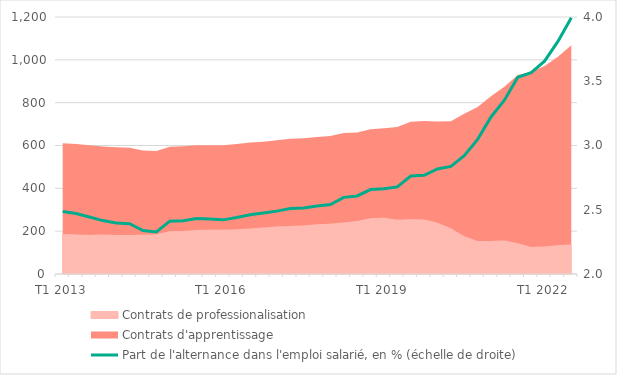
| Category | Part de l'alternance dans l'emploi salarié, en % (échelle de droite) |
|---|---|
| T1 2013 | 2.487 |
| T2 2013 | 2.471 |
| T3 2013 | 2.443 |
| T4 2013 | 2.416 |
| T1 2014 | 2.397 |
| T2 2014 | 2.391 |
| T3 2014 | 2.338 |
| T4 2014 | 2.327 |
| T1 2015 | 2.411 |
| T2 2015 | 2.414 |
| T3 2015 | 2.431 |
| T4 2015 | 2.427 |
| T1 2016 | 2.421 |
| T2 2016 | 2.439 |
| T3 2016 | 2.461 |
| T4 2016 | 2.475 |
| T1 2017 | 2.489 |
| T2 2017 | 2.509 |
| T3 2017 | 2.514 |
| T4 2017 | 2.529 |
| T1 2018 | 2.541 |
| T2 2018 | 2.596 |
| T3 2018 | 2.607 |
| T4 2018 | 2.657 |
| T1 2019 | 2.663 |
| T2 2019 | 2.678 |
| T3 2019 | 2.763 |
| T4 2019 | 2.768 |
| T1 2020 | 2.818 |
| T2 2020 | 2.838 |
| T3 2020 | 2.92 |
| T4 2020 | 3.048 |
| T1 2021 | 3.222 |
| T2 2021 | 3.353 |
| T3 2021 | 3.531 |
| T4 2021 | 3.567 |
| T1 2022 | 3.657 |
| T2 2022 | 3.81 |
| T3 2022 | 3.994 |